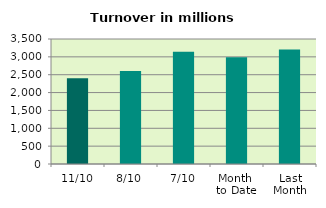
| Category | Series 0 |
|---|---|
| 11/10 | 2402.593 |
| 8/10 | 2600.893 |
| 7/10 | 3140.885 |
| Month 
to Date | 2986.444 |
| Last
Month | 3204.516 |